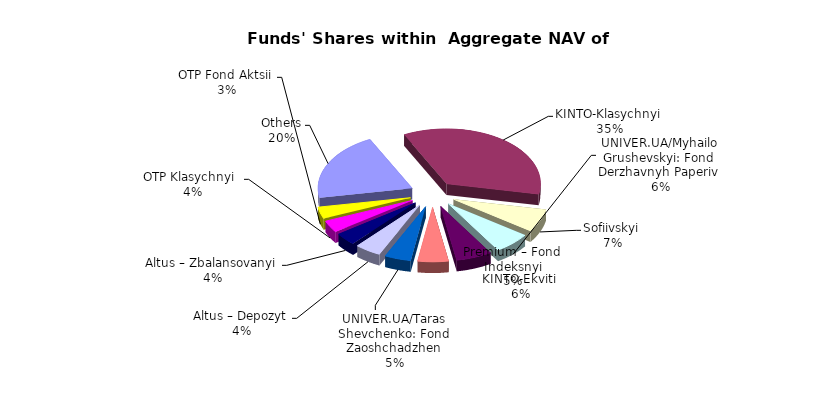
| Category | Series 0 | Series 1 |
|---|---|---|
| Others | 12505668.805 | 0.197 |
| KINTO-Klasychnyi | 21769033.637 | 0.343 |
| Sofiivskyi | 4142839.7 | 0.065 |
| UNIVER.UA/Myhailo Grushevskyi: Fond Derzhavnyh Paperiv | 3882391.16 | 0.061 |
| KINTO-Ekviti | 3778461.29 | 0.06 |
| Premium – Fond Indeksnyi | 3243591.624 | 0.051 |
| UNIVER.UA/Taras Shevchenko: Fond Zaoshchadzhen | 2779706.42 | 0.044 |
| Altus – Depozyt | 2758550.74 | 0.043 |
| Altus – Zbalansovanyi | 2251231.14 | 0.035 |
| OTP Klasychnyi  | 2170007.85 | 0.034 |
| OTP Fond Aktsii | 2117776.38 | 0.033 |